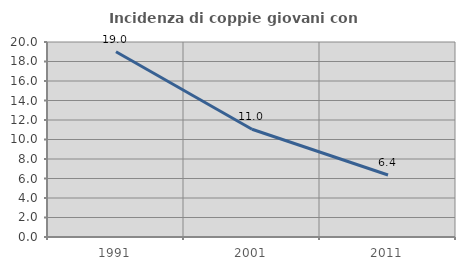
| Category | Incidenza di coppie giovani con figli |
|---|---|
| 1991.0 | 18.995 |
| 2001.0 | 11.049 |
| 2011.0 | 6.361 |